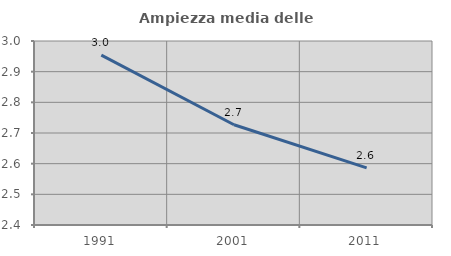
| Category | Ampiezza media delle famiglie |
|---|---|
| 1991.0 | 2.954 |
| 2001.0 | 2.727 |
| 2011.0 | 2.586 |